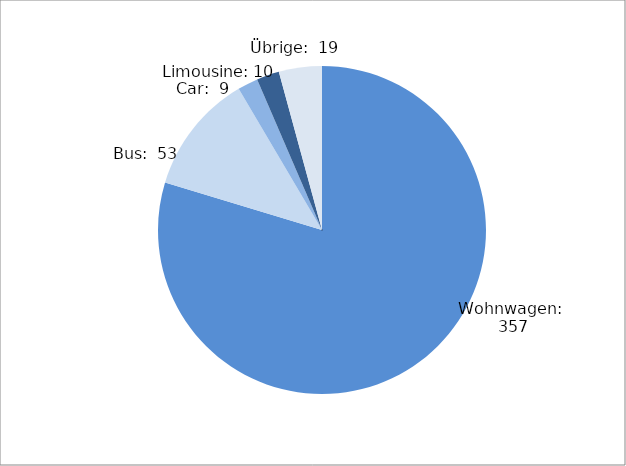
| Category | Series 0 |
|---|---|
| Wohnwagen | 357 |
| Bus | 53 |
| Car | 9 |
| Limousine | 10 |
| Übrige | 19 |